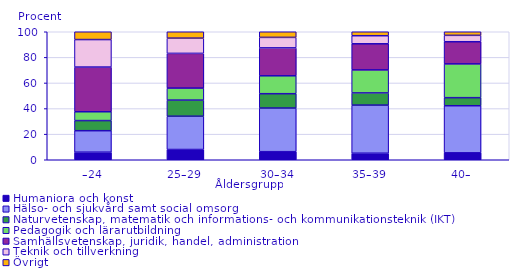
| Category | Humaniora och konst                                                                                                                                    | Hälso- och sjukvård samt social omsorg                                                                                                                 | Naturvetenskap, matematik och informations- och kommunikationsteknik (IKT)                                                                             | Pedagogik och lärarutbildning                                                                                                                          | Samhällsvetenskap, juridik, handel, administration                                                                                                     | Teknik och tillverkning                                                                                                                                | Övrigt |
|---|---|---|---|---|---|---|---|
| –24 | 5.9 | 16.8 | 7.9 | 6.9 | 34.9 | 21.5 | 6.5 |
| 25–29 | 8 | 26 | 12.6 | 9.4 | 27.1 | 11.9 | 5.8 |
| 30–34 | 6.3 | 34.1 | 11.2 | 14 | 21.8 | 8.2 | 5.1 |
| 35–39 | 5.1 | 37.6 | 9.5 | 18 | 20.4 | 6.3 | 3.8 |
| 40– | 5.4 | 36.8 | 6.3 | 26.4 | 17.3 | 5 | 3.6 |